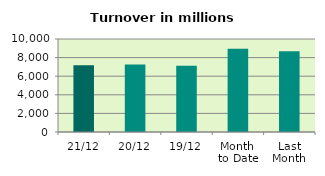
| Category | Series 0 |
|---|---|
| 21/12 | 7180.555 |
| 20/12 | 7261.294 |
| 19/12 | 7133.198 |
| Month 
to Date | 8957.204 |
| Last
Month | 8686.894 |